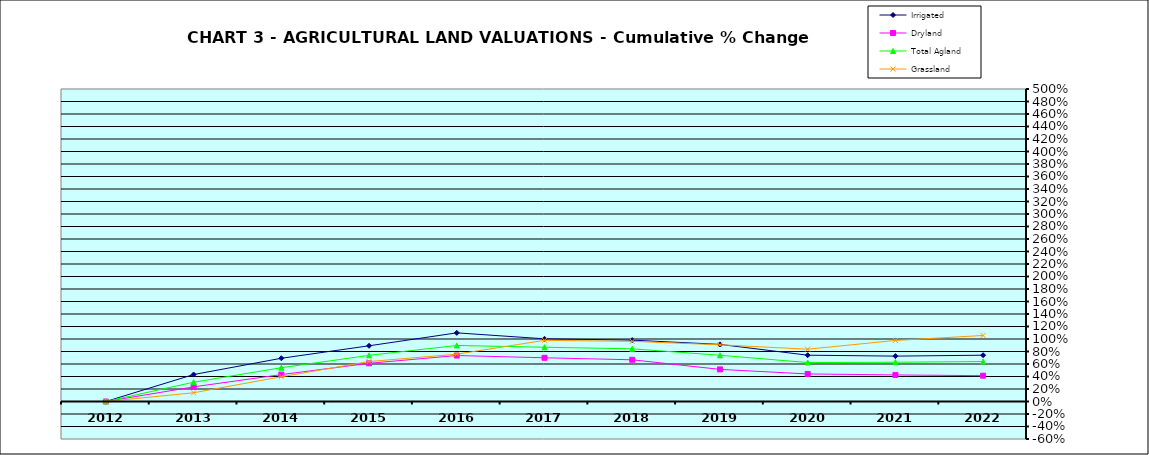
| Category | Irrigated | Dryland | Total Agland | Grassland |
|---|---|---|---|---|
| 2012.0 | 0 | 0 | 0 | 0 |
| 2013.0 | 0.431 | 0.234 | 0.309 | 0.14 |
| 2014.0 | 0.692 | 0.43 | 0.541 | 0.396 |
| 2015.0 | 0.891 | 0.611 | 0.738 | 0.639 |
| 2016.0 | 1.098 | 0.735 | 0.896 | 0.757 |
| 2017.0 | 1.003 | 0.699 | 0.868 | 0.979 |
| 2018.0 | 0.982 | 0.667 | 0.843 | 0.962 |
| 2019.0 | 0.914 | 0.514 | 0.74 | 0.907 |
| 2020.0 | 0.741 | 0.441 | 0.623 | 0.837 |
| 2021.0 | 0.726 | 0.425 | 0.628 | 0.977 |
| 2022.0 | 0.741 | 0.413 | 0.64 | 1.056 |